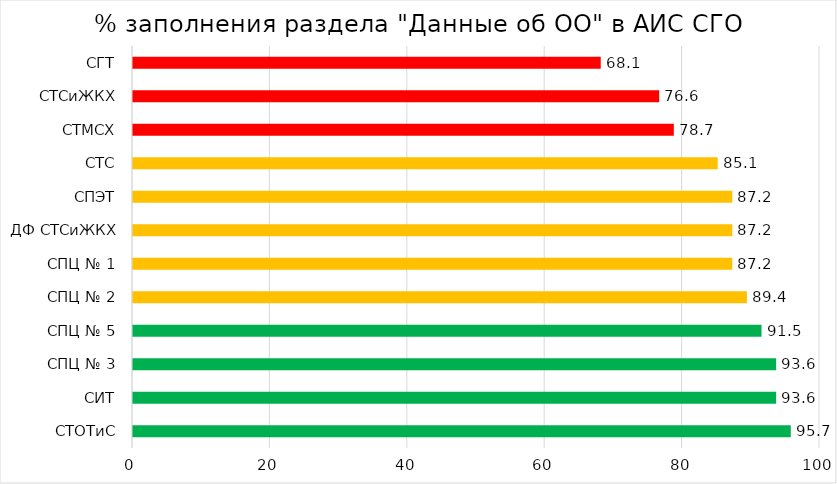
| Category | Series 0 |
|---|---|
| СТОТиС | 95.745 |
| СИТ | 93.617 |
| СПЦ № 3 | 93.617 |
| СПЦ № 5 | 91.489 |
| СПЦ № 2 | 89.362 |
| СПЦ № 1 | 87.234 |
| ДФ СТСиЖКХ | 87.234 |
| СПЭТ | 87.234 |
| СТС | 85.106 |
| СТМСХ | 78.723 |
| СТСиЖКХ | 76.596 |
| СГТ | 68.085 |